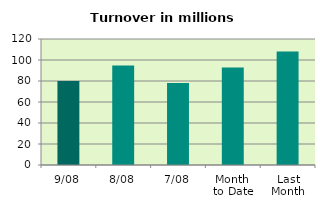
| Category | Series 0 |
|---|---|
| 9/08 | 79.914 |
| 8/08 | 94.766 |
| 7/08 | 77.999 |
| Month 
to Date | 92.907 |
| Last
Month | 108.022 |